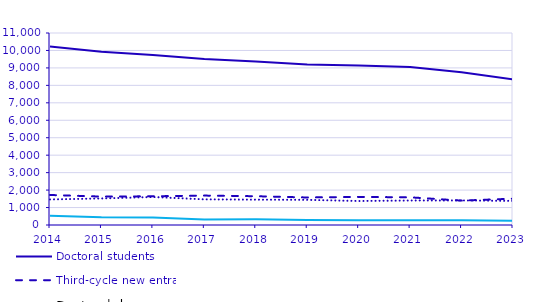
| Category | Doctoral students | Third-cycle new entrants | Doctoral degrees | Licentiate degrees |
|---|---|---|---|---|
| 2014.0 | 10220 | 1720 | 1465 | 529 |
| 2015.0 | 9929 | 1628 | 1521 | 449 |
| 2016.0 | 9736 | 1645 | 1604 | 435 |
| 2017.0 | 9512 | 1685 | 1470 | 322 |
| 2018.0 | 9366 | 1649 | 1452 | 333 |
| 2019.0 | 9198 | 1577 | 1442 | 286 |
| 2020.0 | 9136 | 1610 | 1375 | 271 |
| 2021.0 | 9048 | 1586 | 1403 | 270 |
| 2022.0 | 8746 | 1398 | 1407 | 273 |
| 2023.0 | 8346 | 1507 | 1381 | 238 |